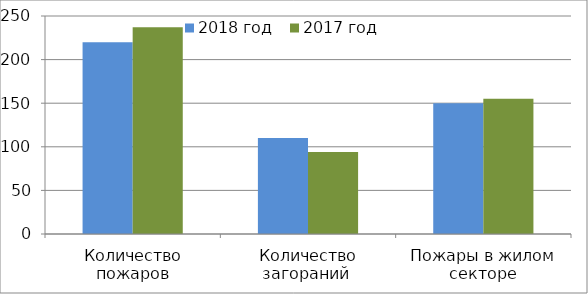
| Category | 2018 год | 2017 год |
|---|---|---|
| Количество пожаров | 220 | 237 |
| Количество загораний  | 110 | 94 |
| Пожары в жилом секторе | 150 | 155 |